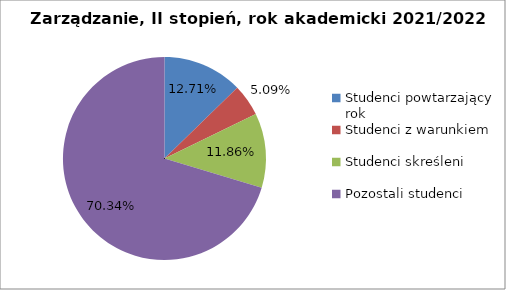
| Category | Series 0 |
|---|---|
| Studenci powtarzający rok | 15 |
| Studenci z warunkiem | 6 |
| Studenci skreśleni | 14 |
| Pozostali studenci | 83 |